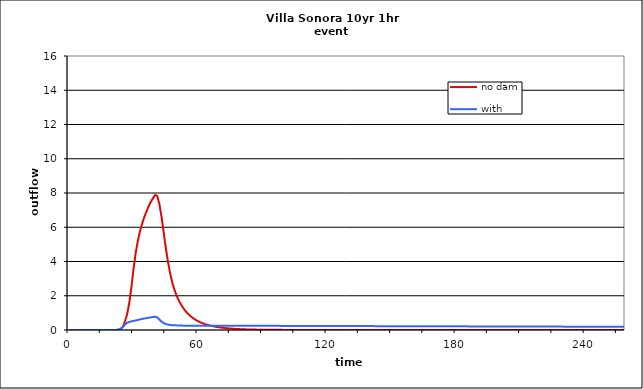
| Category | no dam | with dam |
|---|---|---|
| 0.0 | 0 | 0 |
| 1.0 | 0 | 0 |
| 2.0 | 0 | 0 |
| 3.0 | 0 | 0 |
| 4.0 | 0 | 0 |
| 5.0 | 0 | 0 |
| 6.0 | 0 | 0 |
| 7.0 | 0 | 0 |
| 8.0 | 0 | 0 |
| 9.0 | 0 | 0 |
| 10.0 | 0 | 0 |
| 11.0 | 0 | 0 |
| 12.0 | 0 | 0 |
| 13.0 | 0 | 0 |
| 14.0 | 0 | 0 |
| 15.0 | 0 | 0 |
| 16.0 | 0 | 0 |
| 17.0 | 0 | 0 |
| 18.0 | 0 | 0 |
| 19.0 | 0 | 0 |
| 20.0 | 0 | 0 |
| 21.0 | 0 | 0 |
| 22.0 | 0.004 | 0.004 |
| 23.0 | 0.021 | 0.021 |
| 24.0 | 0.071 | 0.071 |
| 25.0 | 0.174 | 0.176 |
| 26.0 | 0.507 | 0.323 |
| 27.0 | 0.922 | 0.421 |
| 28.0 | 1.588 | 0.471 |
| 29.0 | 2.524 | 0.503 |
| 30.0 | 3.59 | 0.53 |
| 31.0 | 4.519 | 0.558 |
| 32.0 | 5.231 | 0.588 |
| 33.0 | 5.78 | 0.62 |
| 34.0 | 6.219 | 0.647 |
| 35.0 | 6.596 | 0.671 |
| 36.0 | 6.929 | 0.694 |
| 37.0 | 7.227 | 0.716 |
| 38.0 | 7.479 | 0.737 |
| 39.0 | 7.694 | 0.758 |
| 40.0 | 7.883 | 0.779 |
| 41.0 | 7.827 | 0.736 |
| 42.0 | 7.343 | 0.611 |
| 43.0 | 6.6 | 0.488 |
| 44.0 | 5.684 | 0.404 |
| 45.0 | 4.773 | 0.349 |
| 46.0 | 3.969 | 0.314 |
| 47.0 | 3.303 | 0.293 |
| 48.0 | 2.77 | 0.28 |
| 49.0 | 2.346 | 0.273 |
| 50.0 | 2.007 | 0.269 |
| 51.0 | 1.734 | 0.266 |
| 52.0 | 1.5 | 0.261 |
| 53.0 | 1.3 | 0.255 |
| 54.0 | 1.129 | 0.251 |
| 55.0 | 0.986 | 0.249 |
| 56.0 | 0.863 | 0.247 |
| 57.0 | 0.756 | 0.247 |
| 58.0 | 0.664 | 0.246 |
| 59.0 | 0.583 | 0.246 |
| 60.0 | 0.513 | 0.246 |
| 61.0 | 0.453 | 0.246 |
| 62.0 | 0.4 | 0.246 |
| 63.0 | 0.354 | 0.246 |
| 64.0 | 0.313 | 0.247 |
| 65.0 | 0.277 | 0.247 |
| 66.0 | 0.246 | 0.247 |
| 67.0 | 0.218 | 0.247 |
| 68.0 | 0.194 | 0.247 |
| 69.0 | 0.172 | 0.247 |
| 70.0 | 0.153 | 0.247 |
| 71.0 | 0.136 | 0.247 |
| 72.0 | 0.121 | 0.247 |
| 73.0 | 0.108 | 0.247 |
| 74.0 | 0.096 | 0.247 |
| 75.0 | 0.085 | 0.247 |
| 76.0 | 0.075 | 0.247 |
| 77.0 | 0.067 | 0.246 |
| 78.0 | 0.059 | 0.246 |
| 79.0 | 0.053 | 0.246 |
| 80.0 | 0.047 | 0.246 |
| 81.0 | 0.042 | 0.246 |
| 82.0 | 0.037 | 0.245 |
| 83.0 | 0.033 | 0.245 |
| 84.0 | 0.03 | 0.245 |
| 85.0 | 0.027 | 0.244 |
| 86.0 | 0.024 | 0.244 |
| 87.0 | 0.022 | 0.244 |
| 88.0 | 0.02 | 0.244 |
| 89.0 | 0.018 | 0.243 |
| 90.0 | 0.016 | 0.243 |
| 91.0 | 0.015 | 0.243 |
| 92.0 | 0.014 | 0.243 |
| 93.0 | 0.012 | 0.242 |
| 94.0 | 0.011 | 0.242 |
| 95.0 | 0.01 | 0.242 |
| 96.0 | 0.01 | 0.241 |
| 97.0 | 0.009 | 0.241 |
| 98.0 | 0.008 | 0.241 |
| 99.0 | 0.007 | 0.24 |
| 100.0 | 0.007 | 0.24 |
| 101.0 | 0.006 | 0.24 |
| 102.0 | 0.006 | 0.239 |
| 103.0 | 0.005 | 0.239 |
| 104.0 | 0.005 | 0.239 |
| 105.0 | 0.004 | 0.238 |
| 106.0 | 0.004 | 0.238 |
| 107.0 | 0.003 | 0.238 |
| 108.0 | 0.003 | 0.238 |
| 109.0 | 0.003 | 0.237 |
| 110.0 | 0.002 | 0.237 |
| 111.0 | 0.002 | 0.237 |
| 112.0 | 0.002 | 0.236 |
| 113.0 | 0.001 | 0.236 |
| 114.0 | 0.001 | 0.236 |
| 115.0 | 0.001 | 0.235 |
| 116.0 | 0.001 | 0.235 |
| 117.0 | 0.001 | 0.235 |
| 118.0 | 0.001 | 0.234 |
| 119.0 | 0.001 | 0.234 |
| 120.0 | 0.001 | 0.234 |
| 121.0 | 0.001 | 0.233 |
| 122.0 | 0 | 0.233 |
| 123.0 | 0 | 0.233 |
| 124.0 | 0 | 0.232 |
| 125.0 | 0 | 0.232 |
| 126.0 | 0 | 0.232 |
| 127.0 | 0 | 0.231 |
| 128.0 | 0 | 0.231 |
| 129.0 | 0 | 0.231 |
| 130.0 | 0 | 0.23 |
| 131.0 | 0 | 0.23 |
| 132.0 | 0 | 0.23 |
| 133.0 | 0 | 0.229 |
| 134.0 | 0 | 0.229 |
| 135.0 | 0 | 0.229 |
| 136.0 | 0 | 0.228 |
| 137.0 | 0 | 0.228 |
| 138.0 | 0 | 0.228 |
| 139.0 | 0 | 0.227 |
| 140.0 | 0 | 0.227 |
| 141.0 | 0 | 0.227 |
| 142.0 | 0 | 0.226 |
| 143.0 | 0 | 0.226 |
| 144.0 | 0 | 0.226 |
| 145.0 | 0 | 0.225 |
| 146.0 | 0 | 0.225 |
| 147.0 | 0 | 0.225 |
| 148.0 | 0 | 0.224 |
| 149.0 | 0 | 0.224 |
| 150.0 | 0 | 0.224 |
| 151.0 | 0 | 0.223 |
| 152.0 | 0 | 0.223 |
| 153.0 | 0 | 0.223 |
| 154.0 | 0 | 0.222 |
| 155.0 | 0 | 0.222 |
| 156.0 | 0 | 0.222 |
| 157.0 | 0 | 0.221 |
| 158.0 | 0 | 0.221 |
| 159.0 | 0 | 0.221 |
| 160.0 | 0 | 0.22 |
| 161.0 | 0 | 0.22 |
| 162.0 | 0 | 0.22 |
| 163.0 | 0 | 0.219 |
| 164.0 | 0 | 0.219 |
| 165.0 | 0 | 0.218 |
| 166.0 | 0 | 0.218 |
| 167.0 | 0 | 0.218 |
| 168.0 | 0 | 0.217 |
| 169.0 | 0 | 0.217 |
| 170.0 | 0 | 0.217 |
| 171.0 | 0 | 0.216 |
| 172.0 | 0 | 0.216 |
| 173.0 | 0 | 0.216 |
| 174.0 | 0 | 0.215 |
| 175.0 | 0 | 0.215 |
| 176.0 | 0 | 0.215 |
| 177.0 | 0 | 0.214 |
| 178.0 | 0 | 0.214 |
| 179.0 | 0 | 0.214 |
| 180.0 | 0 | 0.213 |
| 181.0 | 0 | 0.213 |
| 182.0 | 0 | 0.213 |
| 183.0 | 0 | 0.212 |
| 184.0 | 0 | 0.212 |
| 185.0 | 0 | 0.212 |
| 186.0 | 0 | 0.211 |
| 187.0 | 0 | 0.211 |
| 188.0 | 0 | 0.211 |
| 189.0 | 0 | 0.21 |
| 190.0 | 0 | 0.21 |
| 191.0 | 0 | 0.21 |
| 192.0 | 0 | 0.209 |
| 193.0 | 0 | 0.209 |
| 194.0 | 0 | 0.209 |
| 195.0 | 0 | 0.208 |
| 196.0 | 0 | 0.208 |
| 197.0 | 0 | 0.208 |
| 198.0 | 0 | 0.207 |
| 199.0 | 0 | 0.207 |
| 200.0 | 0 | 0.207 |
| 201.0 | 0 | 0.206 |
| 202.0 | 0 | 0.206 |
| 203.0 | 0 | 0.206 |
| 204.0 | 0 | 0.205 |
| 205.0 | 0 | 0.205 |
| 206.0 | 0 | 0.205 |
| 207.0 | 0 | 0.204 |
| 208.0 | 0 | 0.204 |
| 209.0 | 0 | 0.204 |
| 210.0 | 0 | 0.203 |
| 211.0 | 0 | 0.203 |
| 212.0 | 0 | 0.203 |
| 213.0 | 0 | 0.202 |
| 214.0 | 0 | 0.202 |
| 215.0 | 0 | 0.202 |
| 216.0 | 0 | 0.201 |
| 217.0 | 0 | 0.201 |
| 218.0 | 0 | 0.201 |
| 219.0 | 0 | 0.2 |
| 220.0 | 0 | 0.2 |
| 221.0 | 0 | 0.2 |
| 222.0 | 0 | 0.199 |
| 223.0 | 0 | 0.199 |
| 224.0 | 0 | 0.199 |
| 225.0 | 0 | 0.198 |
| 226.0 | 0 | 0.198 |
| 227.0 | 0 | 0.198 |
| 228.0 | 0 | 0.197 |
| 229.0 | 0 | 0.197 |
| 230.0 | 0 | 0.197 |
| 231.0 | 0 | 0.196 |
| 232.0 | 0 | 0.196 |
| 233.0 | 0 | 0.196 |
| 234.0 | 0 | 0.195 |
| 235.0 | 0 | 0.195 |
| 236.0 | 0 | 0.195 |
| 237.0 | 0 | 0.195 |
| 238.0 | 0 | 0.194 |
| 239.0 | 0 | 0.194 |
| 240.0 | 0 | 0.194 |
| 241.0 | 0 | 0.193 |
| 242.0 | 0 | 0.193 |
| 243.0 | 0 | 0.193 |
| 244.0 | 0 | 0.192 |
| 245.0 | 0 | 0.192 |
| 246.0 | 0 | 0.192 |
| 247.0 | 0 | 0.191 |
| 248.0 | 0 | 0.191 |
| 249.0 | 0 | 0.191 |
| 250.0 | 0 | 0.19 |
| 251.0 | 0 | 0.19 |
| 252.0 | 0 | 0.19 |
| 253.0 | 0 | 0.189 |
| 254.0 | 0 | 0.189 |
| 255.0 | 0 | 0.189 |
| 256.0 | 0 | 0.188 |
| 257.0 | 0 | 0.188 |
| 258.0 | 0 | 0.188 |